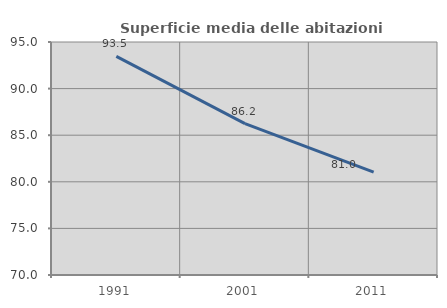
| Category | Superficie media delle abitazioni occupate |
|---|---|
| 1991.0 | 93.46 |
| 2001.0 | 86.242 |
| 2011.0 | 81.033 |